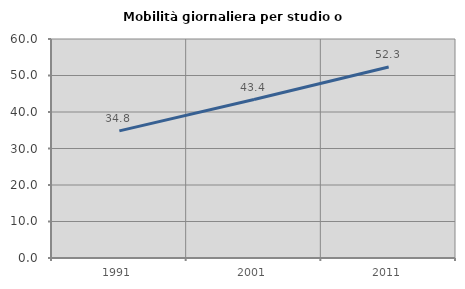
| Category | Mobilità giornaliera per studio o lavoro |
|---|---|
| 1991.0 | 34.834 |
| 2001.0 | 43.404 |
| 2011.0 | 52.311 |